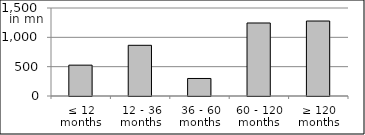
| Category | volume |
|---|---|
| ≤ 12 months | 525877997.78 |
| 12 - 36 months | 864021143.5 |
| 36 - 60 months | 298787561.59 |
| 60 - 120 months | 1244517059.29 |
| ≥ 120 months | 1278123953.594 |